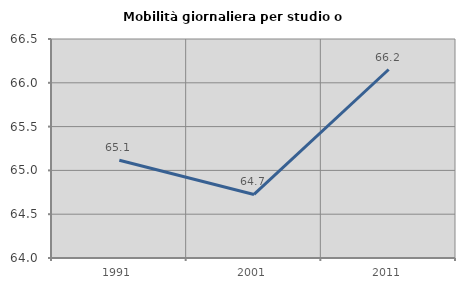
| Category | Mobilità giornaliera per studio o lavoro |
|---|---|
| 1991.0 | 65.115 |
| 2001.0 | 64.725 |
| 2011.0 | 66.152 |